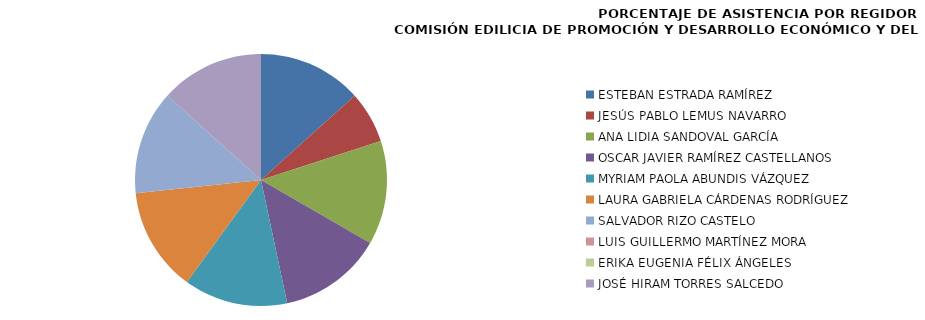
| Category | Series 0 |
|---|---|
| ESTEBAN ESTRADA RAMÍREZ | 2 |
| JESÚS PABLO LEMUS NAVARRO | 1 |
| ANA LIDIA SANDOVAL GARCÍA | 2 |
| OSCAR JAVIER RAMÍREZ CASTELLANOS | 2 |
| MYRIAM PAOLA ABUNDIS VÁZQUEZ | 2 |
| LAURA GABRIELA CÁRDENAS RODRÍGUEZ | 2 |
| SALVADOR RIZO CASTELO | 2 |
| LUIS GUILLERMO MARTÍNEZ MORA | 0 |
| ERIKA EUGENIA FÉLIX ÁNGELES | 0 |
| JOSÉ HIRAM TORRES SALCEDO | 2 |